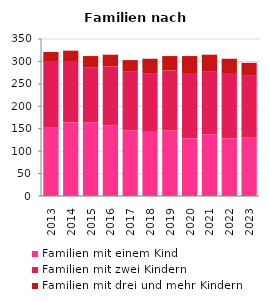
| Category | Familien mit einem Kind | Familien mit zwei Kindern | Familien mit drei und mehr Kindern |
|---|---|---|---|
| 2013.0 | 152 | 149 | 20 |
| 2014.0 | 164 | 137 | 23 |
| 2015.0 | 164 | 122 | 26 |
| 2016.0 | 158 | 131 | 26 |
| 2017.0 | 146 | 131 | 26 |
| 2018.0 | 143 | 131 | 32 |
| 2019.0 | 146 | 134 | 32 |
| 2020.0 | 128 | 146 | 38 |
| 2021.0 | 137 | 140 | 38 |
| 2022.0 | 128 | 146 | 32 |
| 2023.0 | 131 | 137 | 29 |